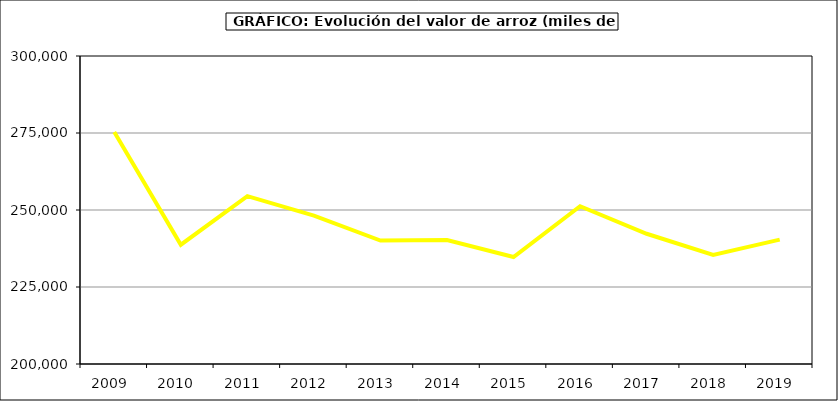
| Category | Valor |
|---|---|
| 2009.0 | 275314.08 |
| 2010.0 | 238727.314 |
| 2011.0 | 254491.862 |
| 2012.0 | 248198.159 |
| 2013.0 | 240076.744 |
| 2014.0 | 240232 |
| 2015.0 | 234720 |
| 2016.0 | 251228 |
| 2017.0 | 242285.097 |
| 2018.0 | 235443.207 |
| 2019.0 | 240367.543 |